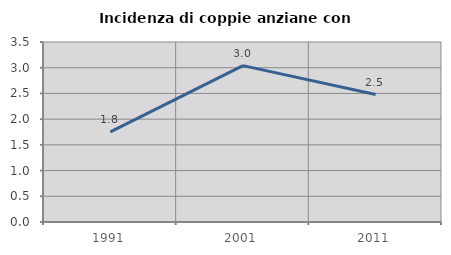
| Category | Incidenza di coppie anziane con figli |
|---|---|
| 1991.0 | 1.752 |
| 2001.0 | 3.04 |
| 2011.0 | 2.478 |